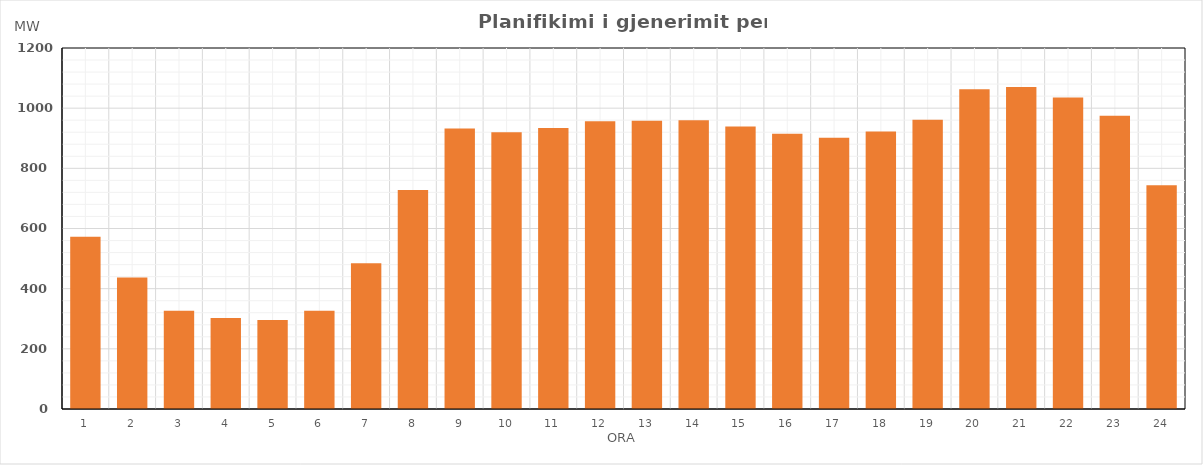
| Category | Max (MW) |
|---|---|
| 0 | 572.4 |
| 1 | 437.445 |
| 2 | 326.905 |
| 3 | 302.4 |
| 4 | 295.63 |
| 5 | 326.714 |
| 6 | 484.504 |
| 7 | 727.698 |
| 8 | 932.619 |
| 9 | 919.67 |
| 10 | 933.765 |
| 11 | 956.82 |
| 12 | 957.788 |
| 13 | 959.867 |
| 14 | 938.815 |
| 15 | 914.681 |
| 16 | 901.615 |
| 17 | 922.67 |
| 18 | 961.86 |
| 19 | 1062.855 |
| 20 | 1070.01 |
| 21 | 1035.841 |
| 22 | 974.65 |
| 23 | 743.89 |